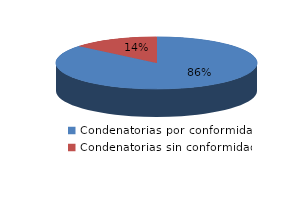
| Category | Series 0 |
|---|---|
| 0 | 514 |
| 1 | 83 |